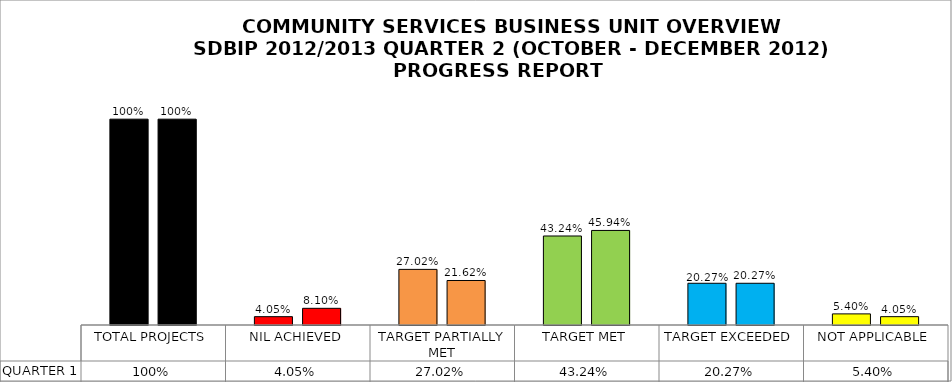
| Category | QUARTER 1 | QUARTER 2 |
|---|---|---|
| TOTAL PROJECTS | 1 | 1 |
| NIL ACHIEVED | 0.04 | 0.081 |
| TARGET PARTIALLY MET | 0.27 | 0.216 |
| TARGET MET | 0.432 | 0.459 |
| TARGET EXCEEDED | 0.203 | 0.203 |
| NOT APPLICABLE | 0.054 | 0.04 |